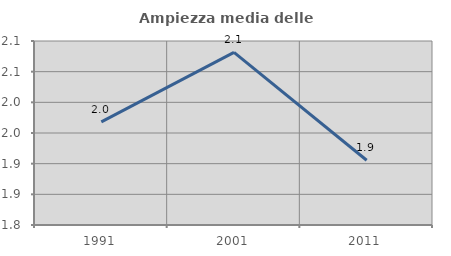
| Category | Ampiezza media delle famiglie |
|---|---|
| 1991.0 | 1.968 |
| 2001.0 | 2.081 |
| 2011.0 | 1.906 |